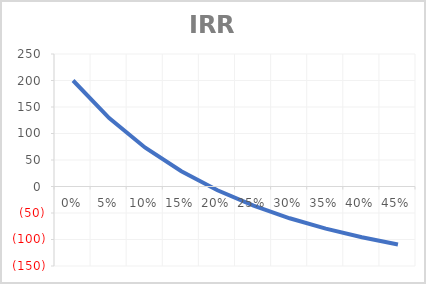
| Category | Series 0 |
|---|---|
| 0.0 | 200 |
| 0.05 | 129.081 |
| 0.1 | 73.205 |
| 0.15 | 28.701 |
| 0.2 | -7.099 |
| 0.25 | -36.16 |
| 0.3 | -59.949 |
| 0.35 | -79.573 |
| 0.4 | -95.877 |
| 0.45 | -109.513 |